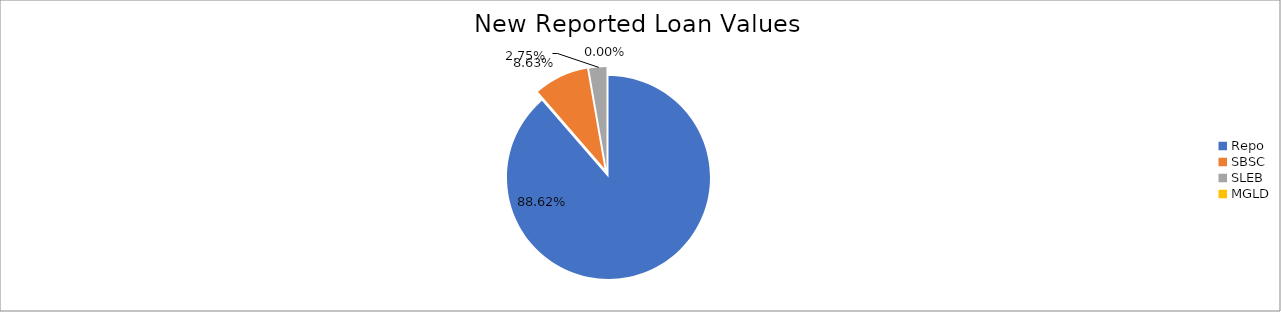
| Category | Series 0 |
|---|---|
| Repo | 10580486.799 |
| SBSC | 1030251.13 |
| SLEB | 327746.103 |
| MGLD | 241.332 |